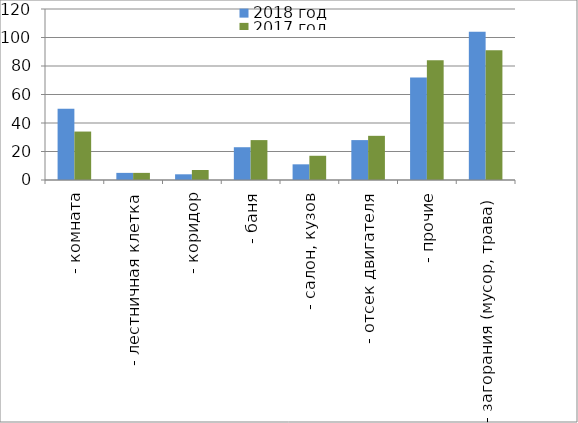
| Category | 2018 год | 2017 год |
|---|---|---|
|  - комната | 50 | 34 |
|  - лестничная клетка | 5 | 5 |
|  - коридор | 4 | 7 |
|  - баня | 23 | 28 |
|  - салон, кузов | 11 | 17 |
|  - отсек двигателя | 28 | 31 |
| - прочие | 72 | 84 |
| - загорания (мусор, трава)  | 104 | 91 |